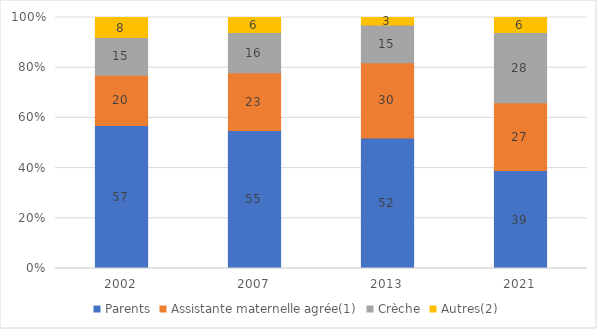
| Category | Parents | Assistante maternelle agrée(1) | Crèche | Autres(2) |
|---|---|---|---|---|
| 2002.0 | 57 | 20 | 15 | 8 |
| 2007.0 | 55 | 23 | 16 | 6 |
| 2013.0 | 52 | 30 | 15 | 3 |
| 2021.0 | 39 | 27 | 28 | 6 |